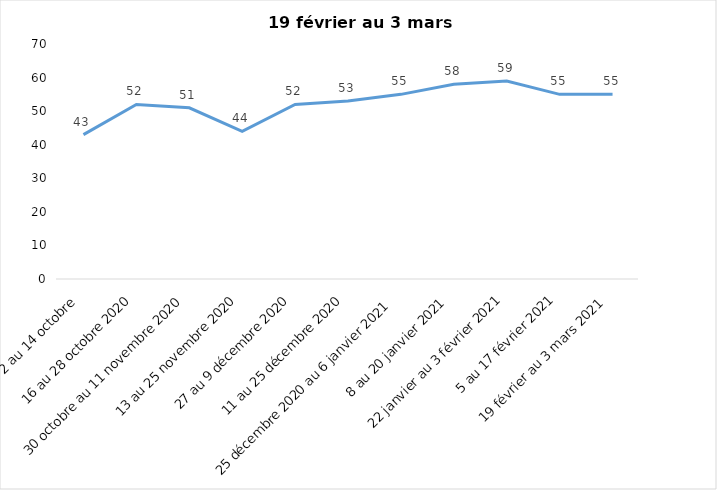
| Category | Toujours aux trois mesures |
|---|---|
| 2 au 14 octobre  | 43 |
| 16 au 28 octobre 2020 | 52 |
| 30 octobre au 11 novembre 2020 | 51 |
| 13 au 25 novembre 2020 | 44 |
| 27 au 9 décembre 2020 | 52 |
| 11 au 25 décembre 2020 | 53 |
| 25 décembre 2020 au 6 janvier 2021 | 55 |
| 8 au 20 janvier 2021 | 58 |
| 22 janvier au 3 février 2021 | 59 |
| 5 au 17 février 2021 | 55 |
| 19 février au 3 mars 2021 | 55 |